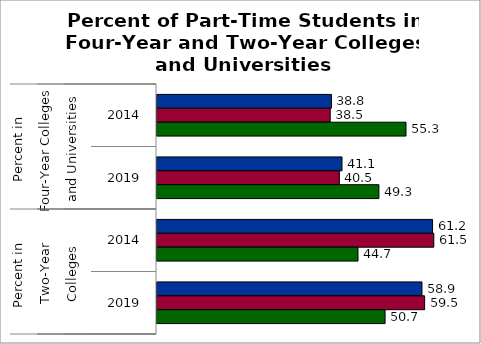
| Category | 50 states and D.C. | SREB states | State |
|---|---|---|---|
| 0 | 38.765 | 38.487 | 55.334 |
| 1 | 41.114 | 40.525 | 49.315 |
| 2 | 61.235 | 61.513 | 44.666 |
| 3 | 58.886 | 59.475 | 50.685 |